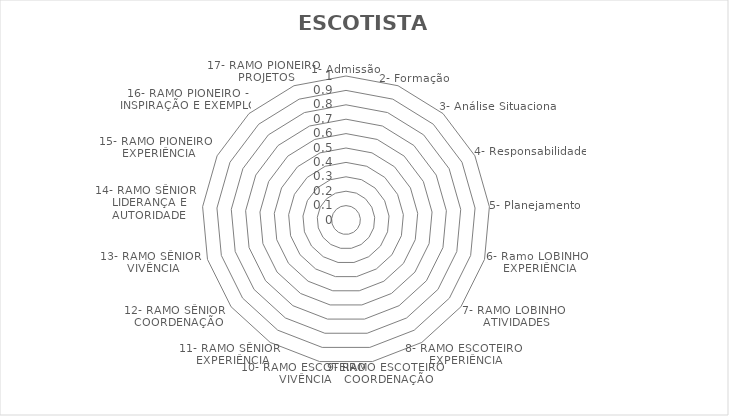
| Category | Respostas |
|---|---|
| 1- Admissão | 0 |
| 2- Formação | 0 |
| 3- Análise Situacional | 0 |
| 4- Responsabilidade | 0 |
| 5- Planejamento | 0 |
| 6- Ramo LOBINHO - EXPERIÊNCIA | 0 |
| 7- RAMO LOBINHO - ATIVIDADES | 0 |
| 8- RAMO ESCOTEIRO - EXPERIÊNCIA | 0 |
| 9- RAMO ESCOTEIRO - COORDENAÇÃO | 0 |
| 10- RAMO ESCOTEIRO - VIVÊNCIA | 0 |
| 11- RAMO SÊNIOR - EXPERIÊNCIA | 0 |
| 12- RAMO SÊNIOR - COORDENAÇÃO | 0 |
| 13- RAMO SÊNIOR - VIVÊNCIA | 0 |
| 14- RAMO SÊNIOR - LIDERANÇA E AUTORIDADE | 0 |
| 15- RAMO PIONEIRO - EXPERIÊNCIA | 0 |
| 16- RAMO PIONEIRO - INSPIRAÇÃO E EXEMPLO | 0 |
| 17- RAMO PIONEIRO - PROJETOS | 0 |